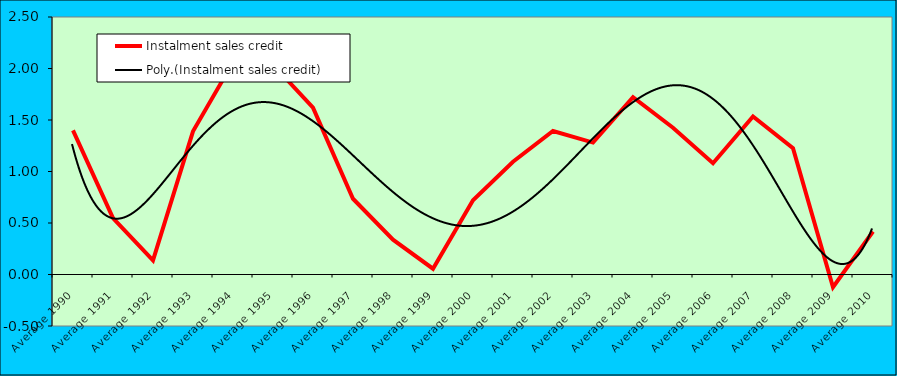
| Category | Instalment sales credit |
|---|---|
| Average 1990 | 1.399 |
| Average 1991 | 0.547 |
| Average 1992 | 0.138 |
| Average 1993 | 1.39 |
| Average 1994 | 2.061 |
| Average 1995 | 2.036 |
| Average 1996 | 1.619 |
| Average 1997 | 0.735 |
| Average 1998 | 0.338 |
| Average 1999 | 0.056 |
| Average 2000 | 0.72 |
| Average 2001 | 1.095 |
| Average 2002 | 1.394 |
| Average 2003 | 1.281 |
| Average 2004 | 1.721 |
| Average 2005 | 1.425 |
| Average 2006 | 1.08 |
| Average 2007 | 1.535 |
| Average 2008 | 1.227 |
| Average 2009 | -0.124 |
| Average 2010 | 0.418 |